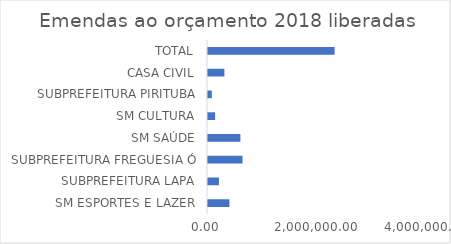
| Category | Series 0 |
|---|---|
| SM ESPORTES E LAZER | 390908 |
| SUBPREFEITURA LAPA | 200000 |
| SUBPREFEITURA FREGUESIA Ó | 630000 |
| SM SAÚDE | 591780 |
| SM CULTURA | 130000 |
| SUBPREFEITURA PIRITUBA | 70000 |
| CASA CIVIL | 300000 |
| TOTAL | 2312688 |